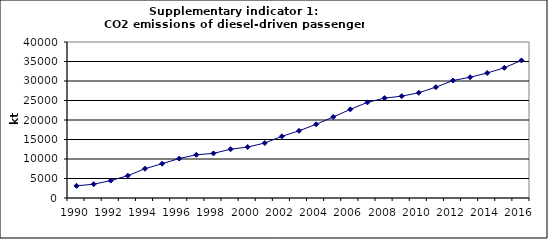
| Category | CO2 emissions of diesel-driven passenger cars, kt |
|---|---|
| 1990 | 3121.651 |
| 1991 | 3531.728 |
| 1992 | 4470.804 |
| 1993 | 5728.073 |
| 1994 | 7511.685 |
| 1995 | 8795.901 |
| 1996 | 10115.823 |
| 1997 | 11083.809 |
| 1998 | 11437.094 |
| 1999 | 12512.016 |
| 2000 | 13063.762 |
| 2001 | 14095.828 |
| 2002 | 15809.513 |
| 2003 | 17227.116 |
| 2004 | 18894.771 |
| 2005 | 20780.999 |
| 2006 | 22731.538 |
| 2007 | 24523.823 |
| 2008 | 25606.068 |
| 2009 | 26112.35 |
| 2010 | 26984.317 |
| 2011 | 28422.433 |
| 2012 | 30126.956 |
| 2013 | 30972.032 |
| 2014 | 32053.697 |
| 2015 | 33381.457 |
| 2016 | 35275.427 |